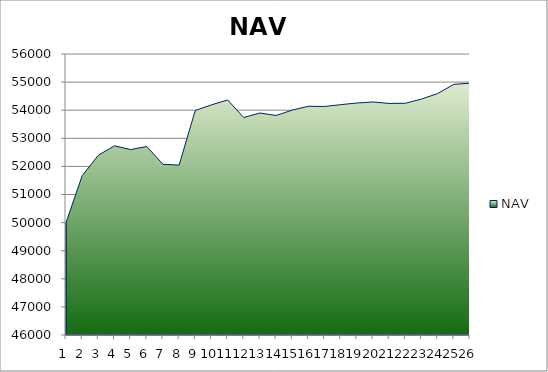
| Category | NAV |
|---|---|
| 0 | 50000 |
| 1 | 51667 |
| 2 | 52397 |
| 3 | 52733.957 |
| 4 | 52597.875 |
| 5 | 52708.772 |
| 6 | 52075.184 |
| 7 | 52046.775 |
| 8 | 53991.219 |
| 9 | 54189.909 |
| 10 | 54364.909 |
| 11 | 53739.909 |
| 12 | 53899.542 |
| 13 | 53812.294 |
| 14 | 54003.961 |
| 15 | 54140.037 |
| 16 | 54132.37 |
| 17 | 54197.37 |
| 18 | 54255.812 |
| 19 | 54292.622 |
| 20 | 54240.699 |
| 21 | 54246.834 |
| 22 | 54397.391 |
| 23 | 54592.197 |
| 24 | 54920.119 |
| 25 | 54963.245 |